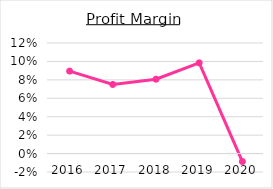
| Category | Series 0 |
|---|---|
| 2016.0 | 0.089 |
| 2017.0 | 0.075 |
| 2018.0 | 0.081 |
| 2019.0 | 0.098 |
| 2020.0 | -0.009 |